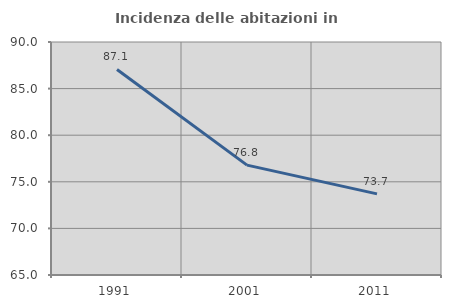
| Category | Incidenza delle abitazioni in proprietà  |
|---|---|
| 1991.0 | 87.056 |
| 2001.0 | 76.79 |
| 2011.0 | 73.705 |